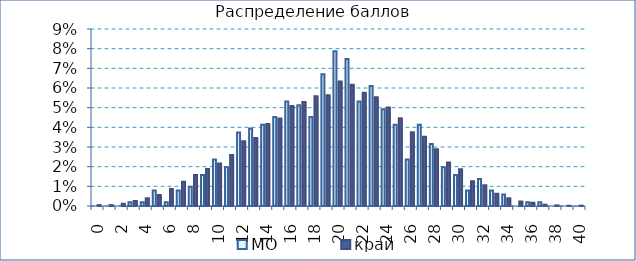
| Category | МО | край |
|---|---|---|
| 0.0 | 0 | 0 |
| 1.0 | 0 | 0 |
| 2.0 | 0 | 0.001 |
| 3.0 | 0.002 | 0.003 |
| 4.0 | 0.002 | 0.004 |
| 5.0 | 0.008 | 0.006 |
| 6.0 | 0.002 | 0.009 |
| 7.0 | 0.008 | 0.012 |
| 8.0 | 0.01 | 0.016 |
| 9.0 | 0.016 | 0.019 |
| 10.0 | 0.024 | 0.022 |
| 11.0 | 0.02 | 0.026 |
| 12.0 | 0.037 | 0.033 |
| 13.0 | 0.039 | 0.035 |
| 14.0 | 0.041 | 0.042 |
| 15.0 | 0.045 | 0.044 |
| 16.0 | 0.053 | 0.051 |
| 17.0 | 0.051 | 0.053 |
| 18.0 | 0.045 | 0.056 |
| 19.0 | 0.067 | 0.056 |
| 20.0 | 0.079 | 0.063 |
| 21.0 | 0.075 | 0.062 |
| 22.0 | 0.053 | 0.058 |
| 23.0 | 0.061 | 0.055 |
| 24.0 | 0.049 | 0.05 |
| 25.0 | 0.041 | 0.045 |
| 26.0 | 0.024 | 0.037 |
| 27.0 | 0.041 | 0.035 |
| 28.0 | 0.031 | 0.029 |
| 29.0 | 0.02 | 0.022 |
| 30.0 | 0.016 | 0.019 |
| 31.0 | 0.008 | 0.013 |
| 32.0 | 0.014 | 0.011 |
| 33.0 | 0.008 | 0.006 |
| 34.0 | 0.006 | 0.004 |
| 35.0 | 0 | 0.002 |
| 36.0 | 0.002 | 0.002 |
| 37.0 | 0.002 | 0.001 |
| 38.0 | 0 | 0 |
| 39.0 | 0 | 0 |
| 40.0 | 0 | 0 |